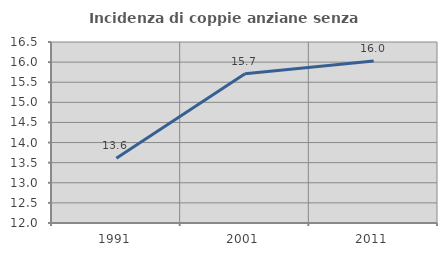
| Category | Incidenza di coppie anziane senza figli  |
|---|---|
| 1991.0 | 13.61 |
| 2001.0 | 15.708 |
| 2011.0 | 16.03 |